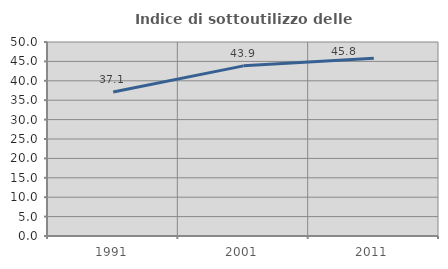
| Category | Indice di sottoutilizzo delle abitazioni  |
|---|---|
| 1991.0 | 37.095 |
| 2001.0 | 43.851 |
| 2011.0 | 45.839 |